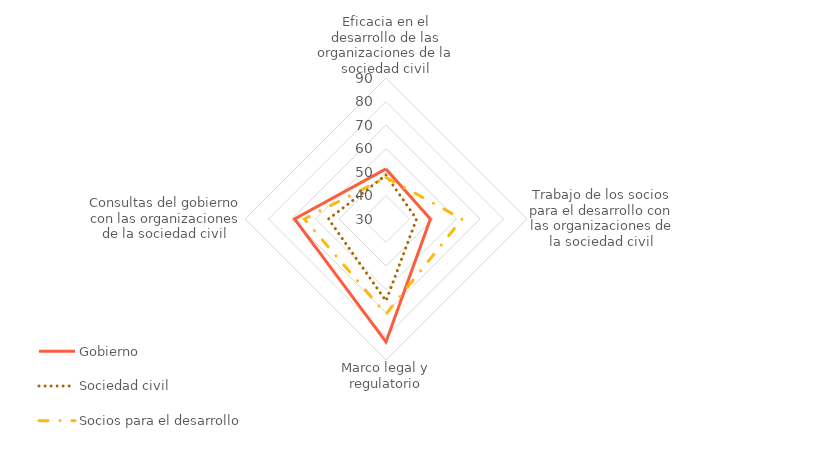
| Category | Gobierno | Sociedad civil | Socios para el desarrollo |
|---|---|---|---|
| Eficacia en el desarrollo de las organizaciones de la sociedad civil | 51.326 | 48.674 | 47.727 |
| Trabajo de los socios para el desarrollo con las organizaciones de la sociedad civil | 48.864 | 42.992 | 62.374 |
| Marco legal y regulatorio | 82.292 | 64.867 | 70.443 |
| Consultas del gobierno con las organizaciones de la sociedad civil | 68.913 | 54.444 | 64.762 |